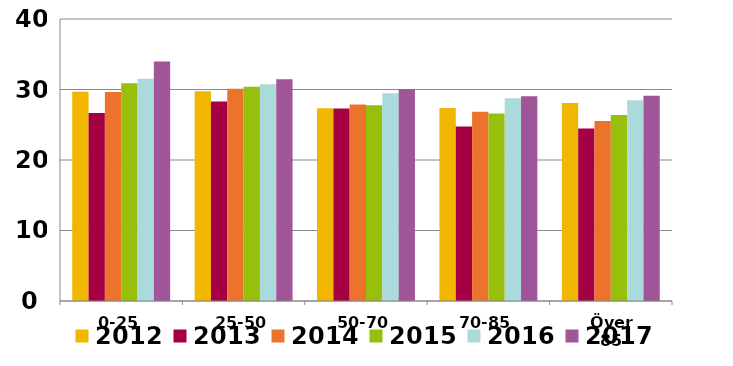
| Category | 2012 | 2013 | 2014 | 2015 | 2016 | 2017 |
|---|---|---|---|---|---|---|
| 0-25 | 29.667 | 26.657 | 29.66 | 30.88 | 31.531 | 33.956 |
| 25-50 | 29.753 | 28.281 | 30.104 | 30.39 | 30.759 | 31.448 |
| 50-70 | 27.336 | 27.301 | 27.871 | 27.781 | 29.483 | 30.022 |
| 70-85 | 27.393 | 24.759 | 26.839 | 26.585 | 28.745 | 29.049 |
| Över 85 | 28.091 | 24.473 | 25.523 | 26.381 | 28.483 | 29.109 |